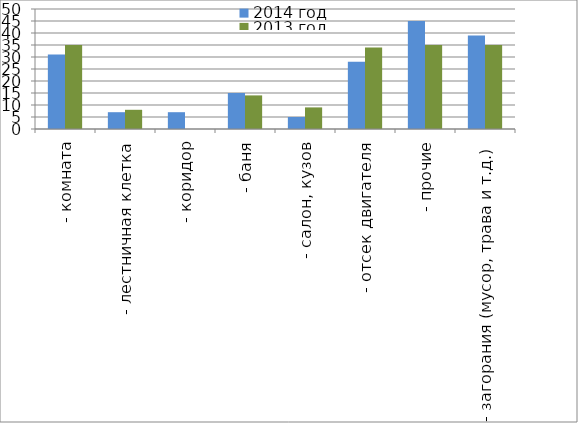
| Category | 2014 год | 2013 год |
|---|---|---|
|  - комната | 31 | 35 |
|  - лестничная клетка | 7 | 8 |
|  - коридор | 7 | 0 |
|  - баня | 15 | 14 |
|  - салон, кузов | 5 | 9 |
|  - отсек двигателя | 28 | 34 |
| - прочие | 45 | 35 |
| - загорания (мусор, трава и т.д.)  | 39 | 35 |